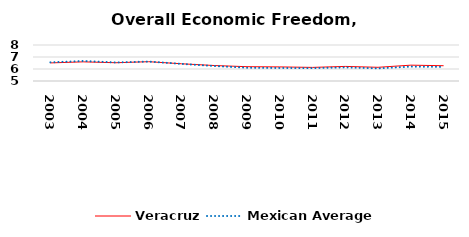
| Category | Veracruz | Mexican Average  |
|---|---|---|
| 2003.0 | 6.507 | 6.552 |
| 2004.0 | 6.596 | 6.668 |
| 2005.0 | 6.521 | 6.546 |
| 2006.0 | 6.609 | 6.619 |
| 2007.0 | 6.436 | 6.428 |
| 2008.0 | 6.29 | 6.248 |
| 2009.0 | 6.192 | 6.106 |
| 2010.0 | 6.174 | 6.086 |
| 2011.0 | 6.134 | 6.074 |
| 2012.0 | 6.216 | 6.134 |
| 2013.0 | 6.142 | 6.054 |
| 2014.0 | 6.32 | 6.2 |
| 2015.0 | 6.273 | 6.174 |